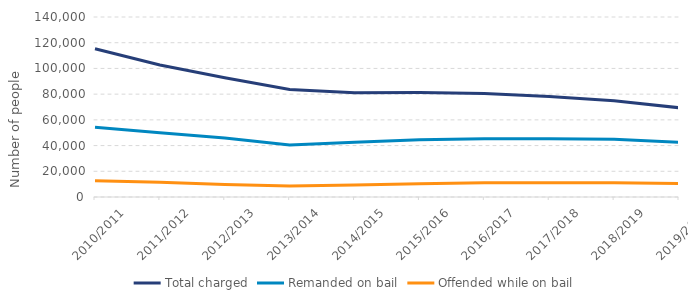
| Category | Total charged | Remanded on bail | Offended while on bail |
|---|---|---|---|
| 2010/2011 | 115257 | 54195 | 12572 |
| 2011/2012 | 102707 | 50025 | 11538 |
| 2012/2013 | 92676 | 45802 | 9721 |
| 2013/2014 | 83619 | 40456 | 8523 |
| 2014/2015 | 81111 | 42591 | 9345 |
| 2015/2016 | 81363 | 44496 | 10312 |
| 2016/2017 | 80526 | 45311 | 11081 |
| 2017/2018 | 78106 | 45296 | 11018 |
| 2018/2019 | 74909 | 44877 | 11064 |
| 2019/2020 | 69432 | 42527 | 10452 |